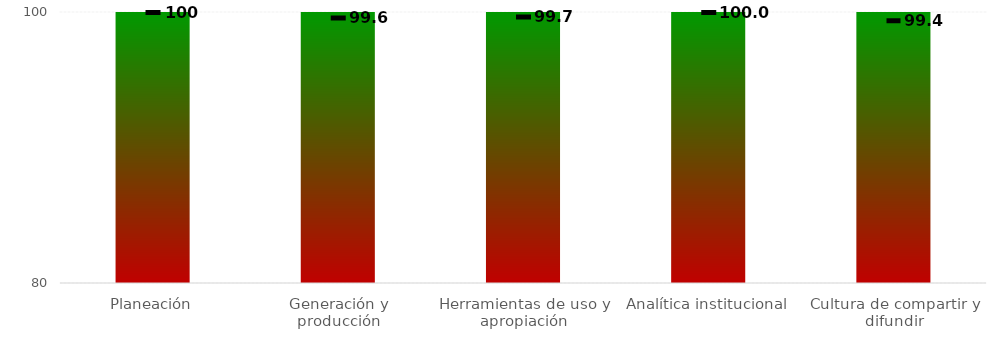
| Category | Rangos |
|---|---|
| Planeación | 100 |
| Generación y producción | 100 |
| Herramientas de uso y apropiación | 100 |
| Analítica institucional | 100 |
| Cultura de compartir y difundir | 100 |